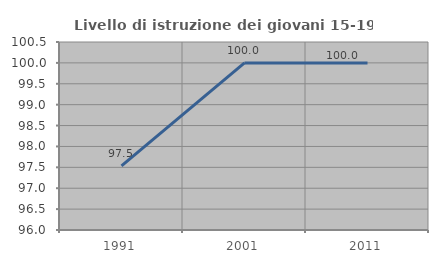
| Category | Livello di istruzione dei giovani 15-19 anni |
|---|---|
| 1991.0 | 97.537 |
| 2001.0 | 100 |
| 2011.0 | 100 |